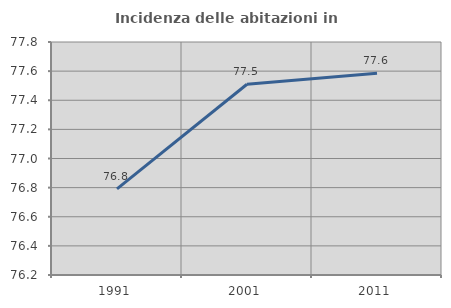
| Category | Incidenza delle abitazioni in proprietà  |
|---|---|
| 1991.0 | 76.792 |
| 2001.0 | 77.51 |
| 2011.0 | 77.586 |